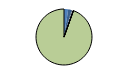
| Category | Series 0 |
|---|---|
| ARRASTRE | 64 |
| CERCO | 51 |
| ATUNEROS CAÑEROS | 13 |
| PALANGRE DE FONDO | 13 |
| PALANGRE DE SUPERFICIE | 2 |
| RASCO | 1 |
| VOLANTA | 1 |
| ARTES FIJAS | 1 |
| ARTES MENORES | 2525 |